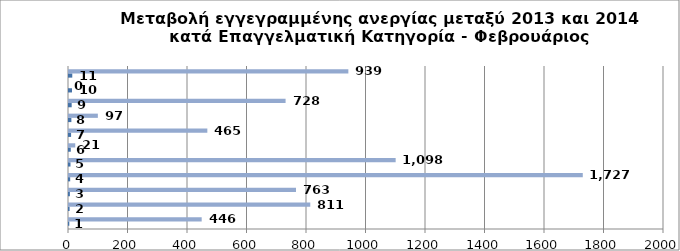
| Category | Series 0 | Series 1 |
|---|---|---|
| 0 | 1 | 446 |
| 1 | 2 | 811 |
| 2 | 3 | 763 |
| 3 | 4 | 1727 |
| 4 | 5 | 1098 |
| 5 | 6 | 21 |
| 6 | 7 | 465 |
| 7 | 8 | 97 |
| 8 | 9 | 728 |
| 9 | 10 | 0 |
| 10 | 11 | 939 |